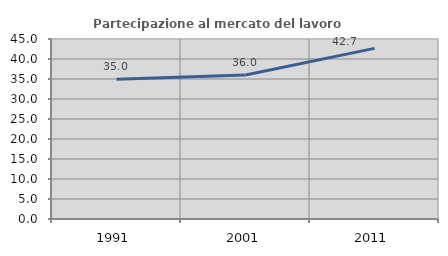
| Category | Partecipazione al mercato del lavoro  femminile |
|---|---|
| 1991.0 | 34.959 |
| 2001.0 | 36.008 |
| 2011.0 | 42.656 |